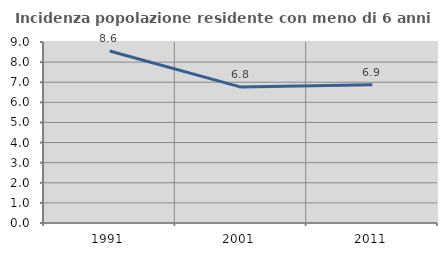
| Category | Incidenza popolazione residente con meno di 6 anni |
|---|---|
| 1991.0 | 8.551 |
| 2001.0 | 6.758 |
| 2011.0 | 6.87 |